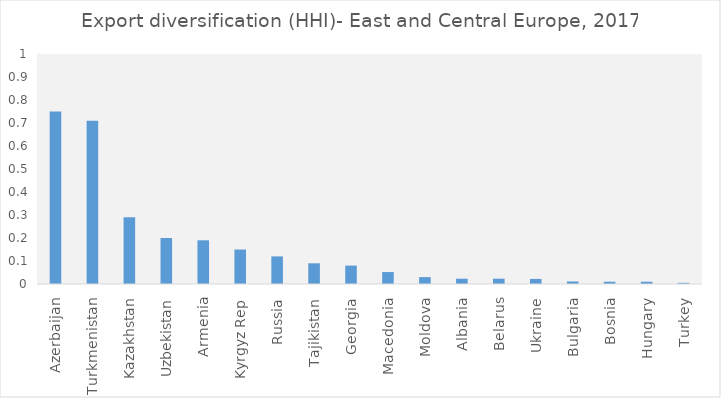
| Category | Series 0 |
|---|---|
| Azerbaijan | 0.75 |
| Turkmenistan | 0.71 |
| Kazakhstan | 0.29 |
| Uzbekistan | 0.2 |
| Armenia | 0.19 |
| Kyrgyz Rep | 0.15 |
| Russia | 0.12 |
| Tajikistan | 0.09 |
| Georgia | 0.08 |
| Macedonia | 0.052 |
| Moldova | 0.03 |
| Albania | 0.023 |
| Belarus | 0.023 |
| Ukraine | 0.022 |
| Bulgaria | 0.011 |
| Bosnia | 0.01 |
| Hungary | 0.01 |
| Turkey | 0.005 |